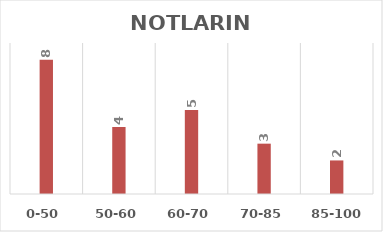
| Category | Series 1 |
|---|---|
| 0-50 | 8 |
| 50-60 | 4 |
| 60-70 | 5 |
| 70-85 | 3 |
| 85-100 | 2 |